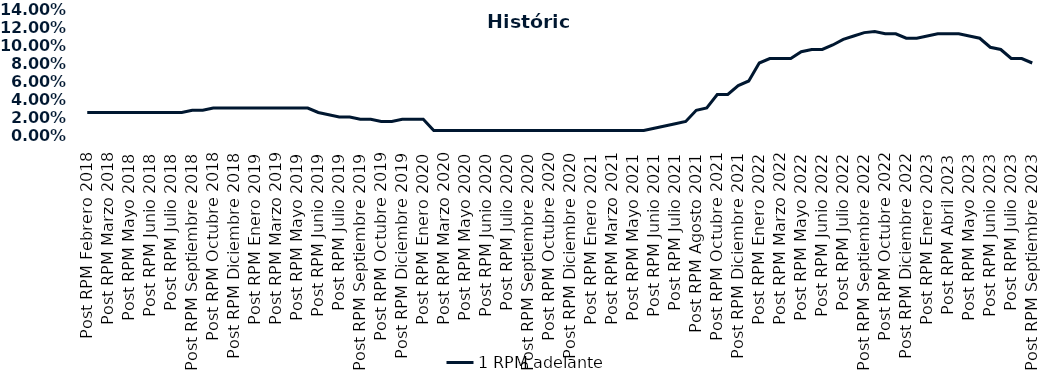
| Category | 1 RPM adelante |
|---|---|
| Post RPM Febrero 2018 | 0.025 |
| Pre RPM Marzo 2018 | 0.025 |
| Post RPM Marzo 2018 | 0.025 |
| Pre RPM Mayo 2018 | 0.025 |
| Post RPM Mayo 2018 | 0.025 |
| Pre RPM Junio 2018 | 0.025 |
| Post RPM Junio 2018 | 0.025 |
| Pre RPM Julio 2018 | 0.025 |
| Post RPM Julio 2018 | 0.025 |
| Pre RPM Septiembre 2018 | 0.025 |
| Post RPM Septiembre 2018 | 0.028 |
| Pre RPM Octubre 2018 | 0.028 |
| Post RPM Octubre 2018 | 0.03 |
| Pre RPM Diciembre 2018 | 0.03 |
| Post RPM Diciembre 2018 | 0.03 |
| Pre RPM Enero 2019 | 0.03 |
| Post RPM Enero 2019 | 0.03 |
| Pre RPM Marzo 2019 | 0.03 |
| Post RPM Marzo 2019 | 0.03 |
| Pre RPM Mayo 2019 | 0.03 |
| Post RPM Mayo 2019 | 0.03 |
| Pre RPM Junio 2019 | 0.03 |
| Post RPM Junio 2019 | 0.025 |
| Pre RPM Julio 2019 | 0.022 |
| Post RPM Julio 2019 | 0.02 |
| Pre RPM Septiembre 2019 | 0.02 |
| Post RPM Septiembre 2019 | 0.018 |
| Pre RPM Octubre 2019 | 0.018 |
| Post RPM Octubre 2019 | 0.015 |
| Pre RPM Diciembre 2019 | 0.015 |
| Post RPM Diciembre 2019 | 0.018 |
| Pre RPM Enero 2020 | 0.018 |
| Post RPM Enero 2020 | 0.018 |
| Pre RPM Marzo 2020 | 0.005 |
| Post RPM Marzo 2020 | 0.005 |
| Pre RPM Mayo 2020 | 0.005 |
| Post RPM Mayo 2020 | 0.005 |
| Pre RPM Junio 2020 | 0.005 |
| Post RPM Junio 2020 | 0.005 |
| Pre RPM Julio 2020 | 0.005 |
| Post RPM Julio 2020 | 0.005 |
| Pre RPM Septiembre 2020 | 0.005 |
| Post RPM Septiembre 2020 | 0.005 |
| Pre RPM Octubre 2020 | 0.005 |
| Post RPM Octubre 2020 | 0.005 |
| Pre RPM Diciembre 2020 | 0.005 |
| Post RPM Diciembre 2020 | 0.005 |
| Pre RPM Enero 2021 | 0.005 |
| Post RPM Enero 2021 | 0.005 |
| Pre RPM Marzo 2021 | 0.005 |
| Post RPM Marzo 2021 | 0.005 |
| Pre RPM Mayo 2021 | 0.005 |
| Post RPM Mayo 2021 | 0.005 |
| Pre RPM Junio 2021 | 0.005 |
| Post RPM Junio 2021 | 0.008 |
| Pre RPM Julio 2021 | 0.01 |
| Post RPM Julio 2021 | 0.012 |
| Pre RPM Agosto 2021 | 0.015 |
| Post RPM Agosto 2021 | 0.028 |
| Pre RPM Octubre 2021 | 0.03 |
| Post RPM Octubre 2021 | 0.045 |
| Pre RPM Diciembre 2021 | 0.045 |
| Post RPM Diciembre 2021 | 0.055 |
| Pre RPM Enero 2022 | 0.06 |
| Post RPM Enero 2022 | 0.08 |
| Pre RPM Marzo 2022 | 0.085 |
| Post RPM Marzo 2022 | 0.085 |
| Pre RPM Mayo 2022 | 0.085 |
| Post RPM Mayo 2022 | 0.092 |
| Pre RPM Junio 2022 | 0.095 |
| Post RPM Junio 2022 | 0.095 |
| Pre RPM Julio 2022 | 0.1 |
| Post RPM Julio 2022 | 0.106 |
| Pre RPM Septiembre 2022 | 0.11 |
| Post RPM Septiembre 2022 | 0.114 |
| Pre RPM Octubre 2022 | 0.115 |
| Post RPM Octubre 2022 | 0.112 |
| Pre RPM Diciembre 2022 | 0.112 |
| Post RPM Diciembre 2022 | 0.108 |
| Pre RPM Enero 2023 | 0.108 |
| Post RPM Enero 2023 | 0.11 |
| Pre RPM Abril 2023 | 0.112 |
| Post RPM Abril 2023 | 0.112 |
| Pre RPM Mayo 2023 | 0.112 |
| Post RPM Mayo 2023 | 0.11 |
| Pre RPM Junio 2023 | 0.108 |
| Post RPM Junio 2023 | 0.098 |
| Pre RPM Julio 2023 | 0.095 |
| Post RPM Julio 2023 | 0.085 |
| Pre RPM Septiembre 2023 | 0.085 |
| Post RPM Septiembre 2023 | 0.08 |